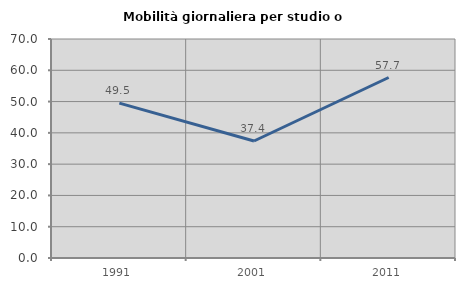
| Category | Mobilità giornaliera per studio o lavoro |
|---|---|
| 1991.0 | 49.521 |
| 2001.0 | 37.402 |
| 2011.0 | 57.692 |